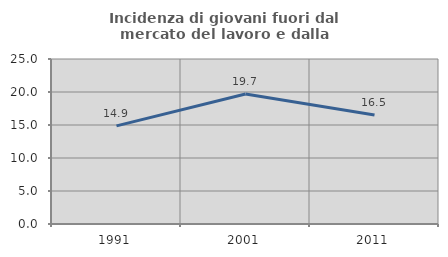
| Category | Incidenza di giovani fuori dal mercato del lavoro e dalla formazione  |
|---|---|
| 1991.0 | 14.871 |
| 2001.0 | 19.697 |
| 2011.0 | 16.509 |